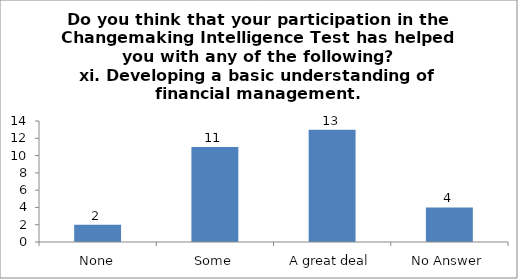
| Category | Do you think that your participation in the Changemaking Intelligence Test has helped you with any of the following?
xi. Developing a basic understanding of financial management. |
|---|---|
| None | 2 |
| Some | 11 |
| A great deal | 13 |
| No Answer | 4 |